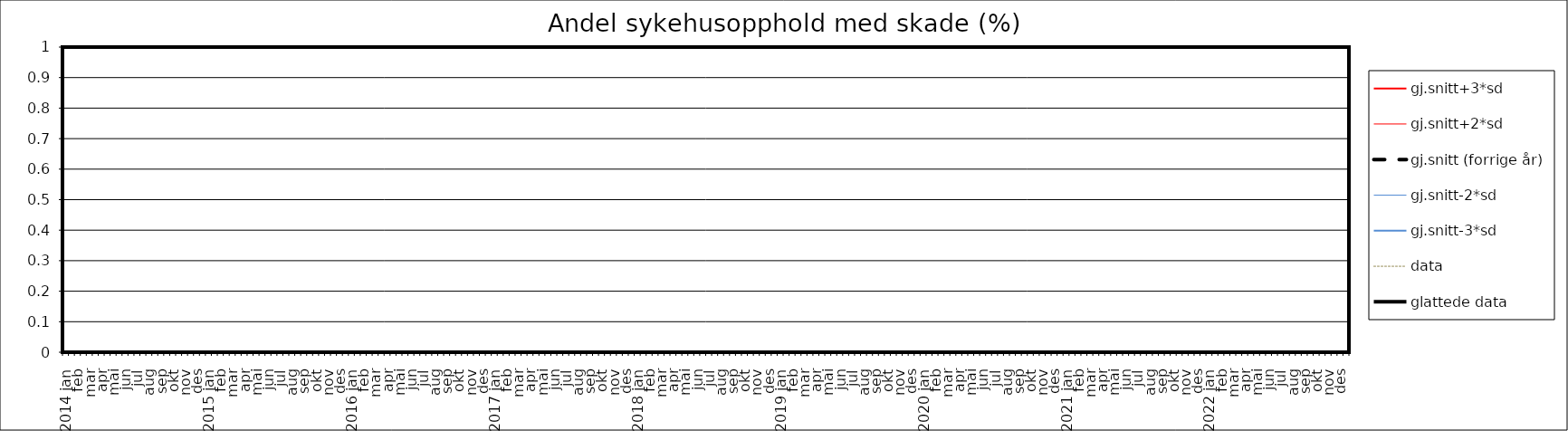
| Category | gj.snitt+3*sd | gj.snitt+2*sd | gj.snitt (forrige år) | gj.snitt-2*sd | gj.snitt-3*sd | data | glattede data |
|---|---|---|---|---|---|---|---|
| 2014 jan | 0 | 0 | 0 | 0 | 0 | 0 | 0 |
|  | 0 | 0 | 0 | 0 | 0 | 0 | 0 |
| feb | 0 | 0 | 0 | 0 | 0 | 0 | 0 |
|  | 0 | 0 | 0 | 0 | 0 | 0 | 0 |
| mar | 0 | 0 | 0 | 0 | 0 | 0 | 0 |
|  | 0 | 0 | 0 | 0 | 0 | 0 | 0 |
| apr | 0 | 0 | 0 | 0 | 0 | 0 | 0 |
|  | 0 | 0 | 0 | 0 | 0 | 0 | 0 |
| mai | 0 | 0 | 0 | 0 | 0 | 0 | 0 |
|  | 0 | 0 | 0 | 0 | 0 | 0 | 0 |
| jun | 0 | 0 | 0 | 0 | 0 | 0 | 0 |
|  | 0 | 0 | 0 | 0 | 0 | 0 | 0 |
| jul | 0 | 0 | 0 | 0 | 0 | 0 | 0 |
|  | 0 | 0 | 0 | 0 | 0 | 0 | 0 |
| aug | 0 | 0 | 0 | 0 | 0 | 0 | 0 |
|  | 0 | 0 | 0 | 0 | 0 | 0 | 0 |
| sep | 0 | 0 | 0 | 0 | 0 | 0 | 0 |
|  | 0 | 0 | 0 | 0 | 0 | 0 | 0 |
| okt | 0 | 0 | 0 | 0 | 0 | 0 | 0 |
|  | 0 | 0 | 0 | 0 | 0 | 0 | 0 |
| nov | 0 | 0 | 0 | 0 | 0 | 0 | 0 |
|  | 0 | 0 | 0 | 0 | 0 | 0 | 0 |
| des | 0 | 0 | 0 | 0 | 0 | 0 | 0 |
|  | 0 | 0 | 0 | 0 | 0 | 0 | 0 |
| 2015 jan | 0 | 0 | 0 | 0 | 0 | 0 | 0 |
|  | 0 | 0 | 0 | 0 | 0 | 0 | 0 |
| feb | 0 | 0 | 0 | 0 | 0 | 0 | 0 |
|  | 0 | 0 | 0 | 0 | 0 | 0 | 0 |
| mar | 0 | 0 | 0 | 0 | 0 | 0 | 0 |
|  | 0 | 0 | 0 | 0 | 0 | 0 | 0 |
| apr | 0 | 0 | 0 | 0 | 0 | 0 | 0 |
|  | 0 | 0 | 0 | 0 | 0 | 0 | 0 |
| mai | 0 | 0 | 0 | 0 | 0 | 0 | 0 |
|  | 0 | 0 | 0 | 0 | 0 | 0 | 0 |
| jun | 0 | 0 | 0 | 0 | 0 | 0 | 0 |
|  | 0 | 0 | 0 | 0 | 0 | 0 | 0 |
| jul | 0 | 0 | 0 | 0 | 0 | 0 | 0 |
|  | 0 | 0 | 0 | 0 | 0 | 0 | 0 |
| aug | 0 | 0 | 0 | 0 | 0 | 0 | 0 |
|  | 0 | 0 | 0 | 0 | 0 | 0 | 0 |
| sep | 0 | 0 | 0 | 0 | 0 | 0 | 0 |
|  | 0 | 0 | 0 | 0 | 0 | 0 | 0 |
| okt | 0 | 0 | 0 | 0 | 0 | 0 | 0 |
|  | 0 | 0 | 0 | 0 | 0 | 0 | 0 |
| nov | 0 | 0 | 0 | 0 | 0 | 0 | 0 |
|  | 0 | 0 | 0 | 0 | 0 | 0 | 0 |
| des | 0 | 0 | 0 | 0 | 0 | 0 | 0 |
|  | 0 | 0 | 0 | 0 | 0 | 0 | 0 |
| 2016 jan | 0 | 0 | 0 | 0 | 0 | 0 | 0 |
|  | 0 | 0 | 0 | 0 | 0 | 0 | 0 |
| feb | 0 | 0 | 0 | 0 | 0 | 0 | 0 |
|  | 0 | 0 | 0 | 0 | 0 | 0 | 0 |
| mar | 0 | 0 | 0 | 0 | 0 | 0 | 0 |
|  | 0 | 0 | 0 | 0 | 0 | 0 | 0 |
| apr | 0 | 0 | 0 | 0 | 0 | 0 | 0 |
|  | 0 | 0 | 0 | 0 | 0 | 0 | 0 |
| mai | 0 | 0 | 0 | 0 | 0 | 0 | 0 |
|  | 0 | 0 | 0 | 0 | 0 | 0 | 0 |
| jun | 0 | 0 | 0 | 0 | 0 | 0 | 0 |
|  | 0 | 0 | 0 | 0 | 0 | 0 | 0 |
| jul | 0 | 0 | 0 | 0 | 0 | 0 | 0 |
|  | 0 | 0 | 0 | 0 | 0 | 0 | 0 |
| aug | 0 | 0 | 0 | 0 | 0 | 0 | 0 |
|  | 0 | 0 | 0 | 0 | 0 | 0 | 0 |
| sep | 0 | 0 | 0 | 0 | 0 | 0 | 0 |
|  | 0 | 0 | 0 | 0 | 0 | 0 | 0 |
| okt | 0 | 0 | 0 | 0 | 0 | 0 | 0 |
|  | 0 | 0 | 0 | 0 | 0 | 0 | 0 |
| nov | 0 | 0 | 0 | 0 | 0 | 0 | 0 |
|  | 0 | 0 | 0 | 0 | 0 | 0 | 0 |
| des | 0 | 0 | 0 | 0 | 0 | 0 | 0 |
|  | 0 | 0 | 0 | 0 | 0 | 0 | 0 |
| 2017 jan | 0 | 0 | 0 | 0 | 0 | 0 | 0 |
|  | 0 | 0 | 0 | 0 | 0 | 0 | 0 |
| feb | 0 | 0 | 0 | 0 | 0 | 0 | 0 |
|  | 0 | 0 | 0 | 0 | 0 | 0 | 0 |
| mar | 0 | 0 | 0 | 0 | 0 | 0 | 0 |
|  | 0 | 0 | 0 | 0 | 0 | 0 | 0 |
| apr | 0 | 0 | 0 | 0 | 0 | 0 | 0 |
|  | 0 | 0 | 0 | 0 | 0 | 0 | 0 |
| mai | 0 | 0 | 0 | 0 | 0 | 0 | 0 |
|  | 0 | 0 | 0 | 0 | 0 | 0 | 0 |
| jun | 0 | 0 | 0 | 0 | 0 | 0 | 0 |
|  | 0 | 0 | 0 | 0 | 0 | 0 | 0 |
| jul | 0 | 0 | 0 | 0 | 0 | 0 | 0 |
|  | 0 | 0 | 0 | 0 | 0 | 0 | 0 |
| aug | 0 | 0 | 0 | 0 | 0 | 0 | 0 |
|  | 0 | 0 | 0 | 0 | 0 | 0 | 0 |
| sep | 0 | 0 | 0 | 0 | 0 | 0 | 0 |
|  | 0 | 0 | 0 | 0 | 0 | 0 | 0 |
| okt | 0 | 0 | 0 | 0 | 0 | 0 | 0 |
|  | 0 | 0 | 0 | 0 | 0 | 0 | 0 |
| nov | 0 | 0 | 0 | 0 | 0 | 0 | 0 |
|  | 0 | 0 | 0 | 0 | 0 | 0 | 0 |
| des | 0 | 0 | 0 | 0 | 0 | 0 | 0 |
|  | 0 | 0 | 0 | 0 | 0 | 0 | 0 |
| 2018 jan | 0 | 0 | 0 | 0 | 0 | 0 | 0 |
|  | 0 | 0 | 0 | 0 | 0 | 0 | 0 |
| feb | 0 | 0 | 0 | 0 | 0 | 0 | 0 |
|  | 0 | 0 | 0 | 0 | 0 | 0 | 0 |
| mar | 0 | 0 | 0 | 0 | 0 | 0 | 0 |
|  | 0 | 0 | 0 | 0 | 0 | 0 | 0 |
| apr | 0 | 0 | 0 | 0 | 0 | 0 | 0 |
|  | 0 | 0 | 0 | 0 | 0 | 0 | 0 |
| mai | 0 | 0 | 0 | 0 | 0 | 0 | 0 |
|  | 0 | 0 | 0 | 0 | 0 | 0 | 0 |
| jun | 0 | 0 | 0 | 0 | 0 | 0 | 0 |
|  | 0 | 0 | 0 | 0 | 0 | 0 | 0 |
| jul | 0 | 0 | 0 | 0 | 0 | 0 | 0 |
|  | 0 | 0 | 0 | 0 | 0 | 0 | 0 |
| aug | 0 | 0 | 0 | 0 | 0 | 0 | 0 |
|  | 0 | 0 | 0 | 0 | 0 | 0 | 0 |
| sep | 0 | 0 | 0 | 0 | 0 | 0 | 0 |
|  | 0 | 0 | 0 | 0 | 0 | 0 | 0 |
| okt | 0 | 0 | 0 | 0 | 0 | 0 | 0 |
|  | 0 | 0 | 0 | 0 | 0 | 0 | 0 |
| nov | 0 | 0 | 0 | 0 | 0 | 0 | 0 |
|  | 0 | 0 | 0 | 0 | 0 | 0 | 0 |
| des | 0 | 0 | 0 | 0 | 0 | 0 | 0 |
|  | 0 | 0 | 0 | 0 | 0 | 0 | 0 |
| 2019 jan | 0 | 0 | 0 | 0 | 0 | 0 | 0 |
|  | 0 | 0 | 0 | 0 | 0 | 0 | 0 |
| feb | 0 | 0 | 0 | 0 | 0 | 0 | 0 |
|  | 0 | 0 | 0 | 0 | 0 | 0 | 0 |
| mar | 0 | 0 | 0 | 0 | 0 | 0 | 0 |
|  | 0 | 0 | 0 | 0 | 0 | 0 | 0 |
| apr | 0 | 0 | 0 | 0 | 0 | 0 | 0 |
|  | 0 | 0 | 0 | 0 | 0 | 0 | 0 |
| mai | 0 | 0 | 0 | 0 | 0 | 0 | 0 |
|  | 0 | 0 | 0 | 0 | 0 | 0 | 0 |
| jun | 0 | 0 | 0 | 0 | 0 | 0 | 0 |
|  | 0 | 0 | 0 | 0 | 0 | 0 | 0 |
| jul | 0 | 0 | 0 | 0 | 0 | 0 | 0 |
|  | 0 | 0 | 0 | 0 | 0 | 0 | 0 |
| aug | 0 | 0 | 0 | 0 | 0 | 0 | 0 |
|  | 0 | 0 | 0 | 0 | 0 | 0 | 0 |
| sep | 0 | 0 | 0 | 0 | 0 | 0 | 0 |
|  | 0 | 0 | 0 | 0 | 0 | 0 | 0 |
| okt | 0 | 0 | 0 | 0 | 0 | 0 | 0 |
|  | 0 | 0 | 0 | 0 | 0 | 0 | 0 |
| nov | 0 | 0 | 0 | 0 | 0 | 0 | 0 |
|  | 0 | 0 | 0 | 0 | 0 | 0 | 0 |
| des | 0 | 0 | 0 | 0 | 0 | 0 | 0 |
|  | 0 | 0 | 0 | 0 | 0 | 0 | 0 |
| 2020 jan | 0 | 0 | 0 | 0 | 0 | 0 | 0 |
|  | 0 | 0 | 0 | 0 | 0 | 0 | 0 |
| feb | 0 | 0 | 0 | 0 | 0 | 0 | 0 |
|  | 0 | 0 | 0 | 0 | 0 | 0 | 0 |
| mar | 0 | 0 | 0 | 0 | 0 | 0 | 0 |
|  | 0 | 0 | 0 | 0 | 0 | 0 | 0 |
| apr | 0 | 0 | 0 | 0 | 0 | 0 | 0 |
|  | 0 | 0 | 0 | 0 | 0 | 0 | 0 |
| mai | 0 | 0 | 0 | 0 | 0 | 0 | 0 |
|  | 0 | 0 | 0 | 0 | 0 | 0 | 0 |
| jun | 0 | 0 | 0 | 0 | 0 | 0 | 0 |
|  | 0 | 0 | 0 | 0 | 0 | 0 | 0 |
| jul | 0 | 0 | 0 | 0 | 0 | 0 | 0 |
|  | 0 | 0 | 0 | 0 | 0 | 0 | 0 |
| aug | 0 | 0 | 0 | 0 | 0 | 0 | 0 |
|  | 0 | 0 | 0 | 0 | 0 | 0 | 0 |
| sep | 0 | 0 | 0 | 0 | 0 | 0 | 0 |
|  | 0 | 0 | 0 | 0 | 0 | 0 | 0 |
| okt | 0 | 0 | 0 | 0 | 0 | 0 | 0 |
|  | 0 | 0 | 0 | 0 | 0 | 0 | 0 |
| nov | 0 | 0 | 0 | 0 | 0 | 0 | 0 |
|  | 0 | 0 | 0 | 0 | 0 | 0 | 0 |
| des | 0 | 0 | 0 | 0 | 0 | 0 | 0 |
|  | 0 | 0 | 0 | 0 | 0 | 0 | 0 |
| 2021 jan | 0 | 0 | 0 | 0 | 0 | 0 | 0 |
|  | 0 | 0 | 0 | 0 | 0 | 0 | 0 |
| feb | 0 | 0 | 0 | 0 | 0 | 0 | 0 |
|  | 0 | 0 | 0 | 0 | 0 | 0 | 0 |
| mar | 0 | 0 | 0 | 0 | 0 | 0 | 0 |
|  | 0 | 0 | 0 | 0 | 0 | 0 | 0 |
| apr | 0 | 0 | 0 | 0 | 0 | 0 | 0 |
|  | 0 | 0 | 0 | 0 | 0 | 0 | 0 |
| mai | 0 | 0 | 0 | 0 | 0 | 0 | 0 |
|  | 0 | 0 | 0 | 0 | 0 | 0 | 0 |
| jun | 0 | 0 | 0 | 0 | 0 | 0 | 0 |
|  | 0 | 0 | 0 | 0 | 0 | 0 | 0 |
| jul | 0 | 0 | 0 | 0 | 0 | 0 | 0 |
|  | 0 | 0 | 0 | 0 | 0 | 0 | 0 |
| aug | 0 | 0 | 0 | 0 | 0 | 0 | 0 |
|  | 0 | 0 | 0 | 0 | 0 | 0 | 0 |
| sep | 0 | 0 | 0 | 0 | 0 | 0 | 0 |
|  | 0 | 0 | 0 | 0 | 0 | 0 | 0 |
| okt | 0 | 0 | 0 | 0 | 0 | 0 | 0 |
|  | 0 | 0 | 0 | 0 | 0 | 0 | 0 |
| nov | 0 | 0 | 0 | 0 | 0 | 0 | 0 |
|  | 0 | 0 | 0 | 0 | 0 | 0 | 0 |
| des | 0 | 0 | 0 | 0 | 0 | 0 | 0 |
|  | 0 | 0 | 0 | 0 | 0 | 0 | 0 |
| 2022 jan | 0 | 0 | 0 | 0 | 0 | 0 | 0 |
|  | 0 | 0 | 0 | 0 | 0 | 0 | 0 |
| feb | 0 | 0 | 0 | 0 | 0 | 0 | 0 |
|  | 0 | 0 | 0 | 0 | 0 | 0 | 0 |
| mar | 0 | 0 | 0 | 0 | 0 | 0 | 0 |
|  | 0 | 0 | 0 | 0 | 0 | 0 | 0 |
| apr | 0 | 0 | 0 | 0 | 0 | 0 | 0 |
|  | 0 | 0 | 0 | 0 | 0 | 0 | 0 |
| mai | 0 | 0 | 0 | 0 | 0 | 0 | 0 |
|  | 0 | 0 | 0 | 0 | 0 | 0 | 0 |
| jun | 0 | 0 | 0 | 0 | 0 | 0 | 0 |
|  | 0 | 0 | 0 | 0 | 0 | 0 | 0 |
| jul | 0 | 0 | 0 | 0 | 0 | 0 | 0 |
|  | 0 | 0 | 0 | 0 | 0 | 0 | 0 |
| aug | 0 | 0 | 0 | 0 | 0 | 0 | 0 |
|  | 0 | 0 | 0 | 0 | 0 | 0 | 0 |
| sep | 0 | 0 | 0 | 0 | 0 | 0 | 0 |
|  | 0 | 0 | 0 | 0 | 0 | 0 | 0 |
| okt | 0 | 0 | 0 | 0 | 0 | 0 | 0 |
|  | 0 | 0 | 0 | 0 | 0 | 0 | 0 |
| nov | 0 | 0 | 0 | 0 | 0 | 0 | 0 |
|  | 0 | 0 | 0 | 0 | 0 | 0 | 0 |
| des | 0 | 0 | 0 | 0 | 0 | 0 | 0 |